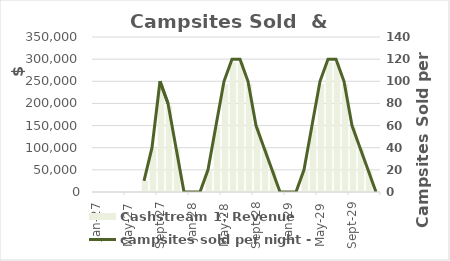
| Category | Cashstream 1: Revenue |
|---|---|
| 2027-01-01 | 0 |
| 2027-02-01 | 0 |
| 2027-03-01 | 0 |
| 2027-04-01 | 0 |
| 2027-05-01 | 0 |
| 2027-06-01 | 0 |
| 2027-07-01 | 24400 |
| 2027-08-01 | 97600 |
| 2027-09-01 | 244000 |
| 2027-10-01 | 195200 |
| 2027-11-01 | 97600 |
| 2027-12-01 | 0 |
| 2028-01-01 | 0 |
| 2028-02-01 | 0 |
| 2028-03-01 | 48800 |
| 2028-04-01 | 146400 |
| 2028-05-01 | 244000 |
| 2028-06-01 | 292800 |
| 2028-07-01 | 292800 |
| 2028-08-01 | 244000 |
| 2028-09-01 | 146400 |
| 2028-10-01 | 97600 |
| 2028-11-01 | 48800 |
| 2028-12-01 | 0 |
| 2029-01-01 | 0 |
| 2029-02-01 | 0 |
| 2029-03-01 | 48800 |
| 2029-04-01 | 146400 |
| 2029-05-01 | 244000 |
| 2029-06-01 | 292800 |
| 2029-07-01 | 292800 |
| 2029-08-01 | 244000 |
| 2029-09-01 | 146400 |
| 2029-10-01 | 97600 |
| 2029-11-01 | 48800 |
| 2029-12-01 | 0 |